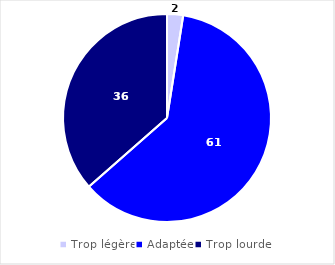
| Category | Series 0 |
|---|---|
| Trop légère | 2.493 |
| Adaptée | 61.032 |
| Trop lourde | 36.474 |